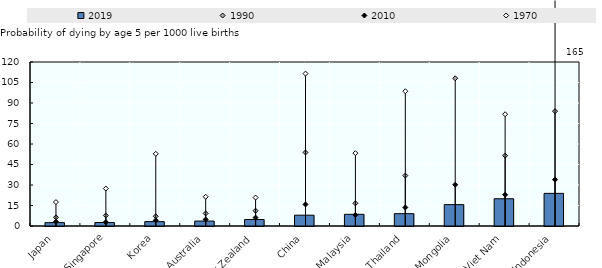
| Category | 2019 |
|---|---|
| Japan | 2.462 |
| Singapore | 2.541 |
| Korea | 3.191 |
| Australia | 3.605 |
| New Zealand | 4.74 |
| China | 7.9 |
| Malaysia | 8.551 |
| Thailand | 9.015 |
| Mongolia | 15.631 |
| Viet Nam | 19.935 |
| Indonesia | 23.881 |